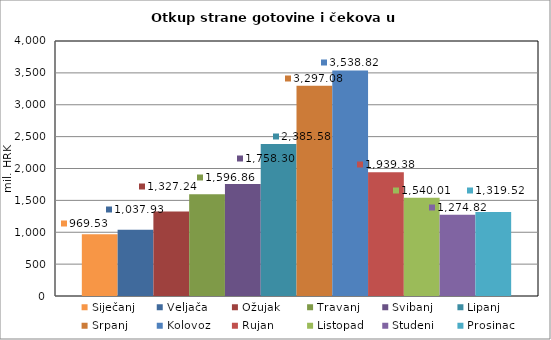
| Category | Siječanj | Veljača | Ožujak | Travanj | Svibanj | Lipanj | Srpanj | Kolovoz | Rujan | Listopad | Studeni | Prosinac |
|---|---|---|---|---|---|---|---|---|---|---|---|---|
| 0 | 969.532 | 1037.926 | 1327.244 | 1596.858 | 1758.303 | 2385.576 | 3297.079 | 3538.819 | 1939.379 | 1540.007 | 1274.822 | 1319.521 |